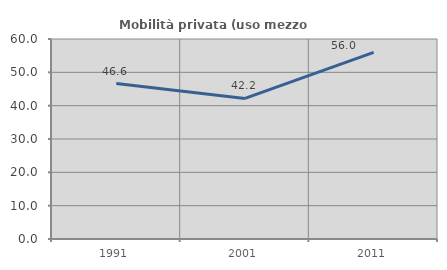
| Category | Mobilità privata (uso mezzo privato) |
|---|---|
| 1991.0 | 46.649 |
| 2001.0 | 42.163 |
| 2011.0 | 56.008 |